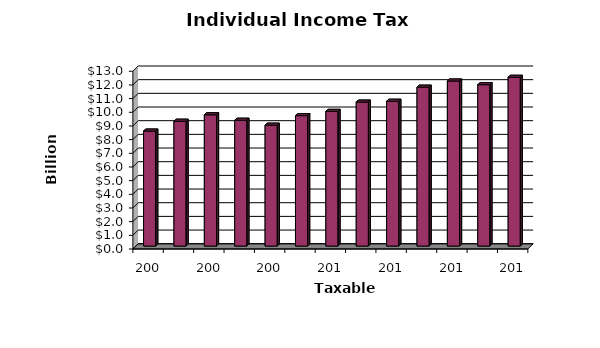
| Category | Series 0 |
|---|---|
| 2005.0 | 8.41 |
| 2006.0 | 9.13 |
| 2007.0 | 9.6 |
| 2008.0 | 9.2 |
| 2009.0 | 8.84 |
| 2010.0 | 9.54 |
| 2011.0 | 9.85 |
| 2012.0 | 10.53 |
| 2013.0 | 10.59 |
| 2014.0 | 11.62 |
| 2015.0 | 12.071 |
| 2016.0 | 11.801 |
| 2017.0 | 12.342 |